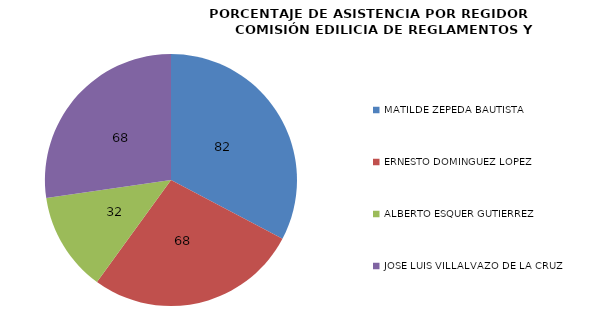
| Category | Series 0 |
|---|---|
| MATILDE ZEPEDA BAUTISTA | 81.818 |
| ERNESTO DOMINGUEZ LOPEZ  | 68.182 |
| ALBERTO ESQUER GUTIERREZ | 31.818 |
| JOSE LUIS VILLALVAZO DE LA CRUZ  | 68.182 |